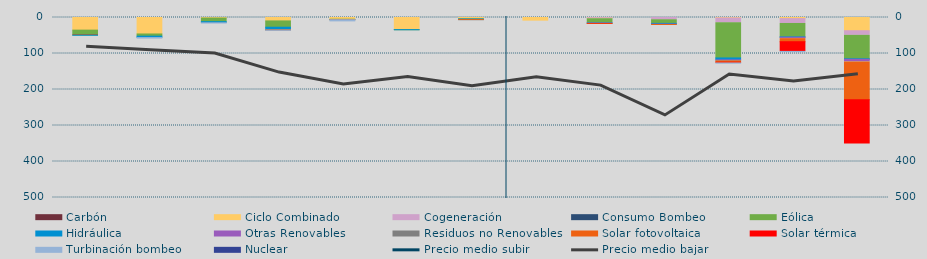
| Category | Carbón | Ciclo Combinado | Cogeneración | Consumo Bombeo | Eólica | Hidráulica | Otras Renovables | Residuos no Renovables | Solar fotovoltaica | Solar térmica | Turbinación bombeo | Nuclear |
|---|---|---|---|---|---|---|---|---|---|---|---|---|
| 0 | 0 | 35080.5 | 0 | 0 | 13742.9 | 373 | 0 | 0 | 0 | 885.1 | 0 | 0 |
| 1 | 0 | 45653 | 130.2 | 0 | 6042.2 | 3888 | 0 | 0 | 0 | 0 | 1300 | 0 |
| 2 | 0 | 1436.8 | 180 | 0 | 9933.5 | 2555.1 | 260 | 362.7 | 0 | 0 | 330 | 0 |
| 3 | 0 | 9373.3 | 187.6 | 0 | 17462.5 | 7049 | 0 | 0 | 881.5 | 0 | 630 | 0 |
| 4 | 0 | 4799.8 | 0 | 0 | 1194.5 | 10 | 0 | 0 | 206.3 | 0 | 3200 | 0 |
| 5 | 0 | 33709.9 | 8 | 0 | 110.5 | 209.5 | 0 | 0 | 0 | 0 | 0 | 0 |
| 6 | 0 | 3930.7 | 0 | 0 | 149.1 | 1762.1 | 0 | 0 | 18.8 | 0 | 0 | 0 |
| 7 | 0 | 7388.9 | 0 | 0 | 0 | 0 | 0 | 0 | 0 | 0 | 0 | 0 |
| 8 | 0 | 582 | 2829.7 | 0 | 11683.6 | 231.6 | 1182.5 | 0 | 155.2 | 1067.3 | 0 | 0 |
| 9 | 0 | 0 | 6237.3 | 0 | 10203.7 | 1917.8 | 944.6 | 0 | 48.1 | 0 | 0 | 0 |
| 10 | 0 | 1230 | 13598.7 | 0 | 97489.7 | 5402.7 | 1813.8 | 1013 | 3586.5 | 2430.1 | 317.4 | 0 |
| 11 | 0 | 3090.6 | 13474.7 | 0 | 37149 | 1123.6 | 3207.9 | 675 | 8550.9 | 27054.6 | 431 | 0 |
| 12 | 0 | 36734.9 | 12855.2 | 0 | 65071.5 | 1518 | 6583 | 675 | 105142.4 | 122842 | 0 | 0 |